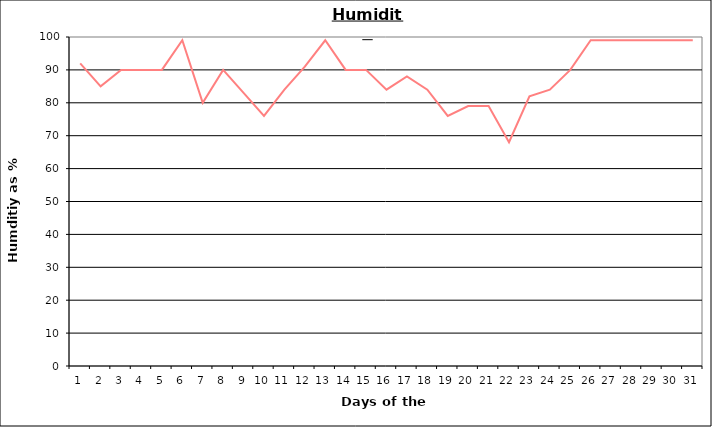
| Category | Series 0 |
|---|---|
| 0 | 92 |
| 1 | 85 |
| 2 | 90 |
| 3 | 90 |
| 4 | 90 |
| 5 | 99 |
| 6 | 80 |
| 7 | 90 |
| 8 | 83 |
| 9 | 76 |
| 10 | 84 |
| 11 | 91 |
| 12 | 99 |
| 13 | 90 |
| 14 | 90 |
| 15 | 84 |
| 16 | 88 |
| 17 | 84 |
| 18 | 76 |
| 19 | 79 |
| 20 | 79 |
| 21 | 68 |
| 22 | 82 |
| 23 | 84 |
| 24 | 90 |
| 25 | 99 |
| 26 | 99 |
| 27 | 99 |
| 28 | 99 |
| 29 | 99 |
| 30 | 99 |